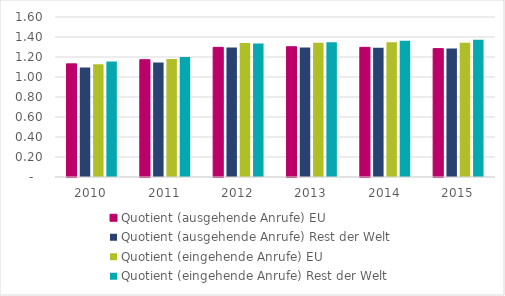
| Category | Quotient (ausgehende Anrufe) EU | Quotient (ausgehende Anrufe) Rest der Welt | Quotient (eingehende Anrufe) EU | Quotient (eingehende Anrufe) Rest der Welt |
|---|---|---|---|---|
| 2010.0 | 1.131 | 1.096 | 1.128 | 1.156 |
| 2011.0 | 1.173 | 1.146 | 1.18 | 1.2 |
| 2012.0 | 1.297 | 1.296 | 1.341 | 1.335 |
| 2013.0 | 1.303 | 1.295 | 1.342 | 1.348 |
| 2014.0 | 1.297 | 1.293 | 1.349 | 1.364 |
| 2015.0 | 1.284 | 1.285 | 1.341 | 1.372 |